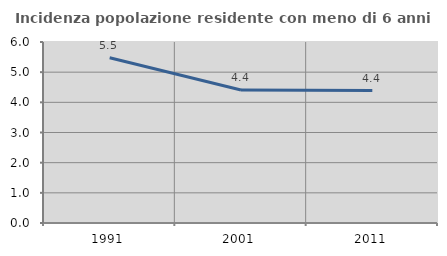
| Category | Incidenza popolazione residente con meno di 6 anni |
|---|---|
| 1991.0 | 5.478 |
| 2001.0 | 4.411 |
| 2011.0 | 4.392 |